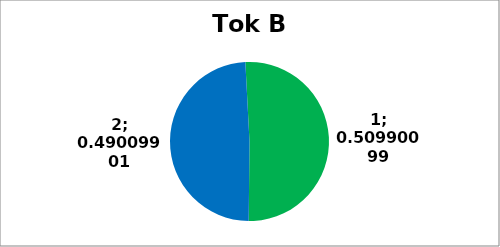
| Category | Series 0 |
|---|---|
| 0 | 103 |
| 1 | 99 |